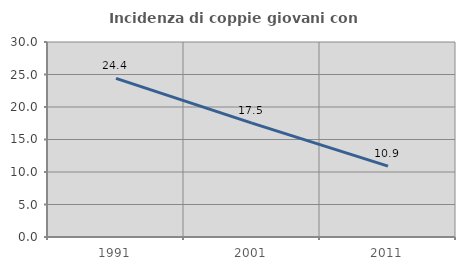
| Category | Incidenza di coppie giovani con figli |
|---|---|
| 1991.0 | 24.398 |
| 2001.0 | 17.52 |
| 2011.0 | 10.909 |